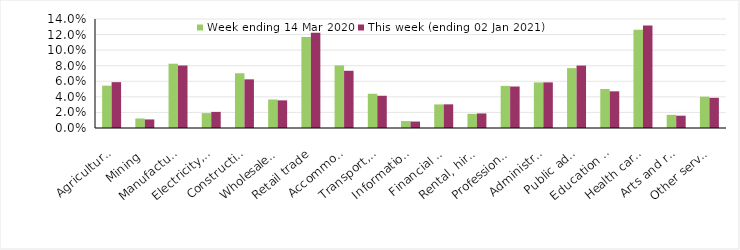
| Category | Week ending 14 Mar 2020 | This week (ending 02 Jan 2021) |
|---|---|---|
| Agriculture, forestry and fishing | 0.054 | 0.059 |
| Mining | 0.012 | 0.011 |
| Manufacturing | 0.083 | 0.08 |
| Electricity, gas, water and waste services | 0.019 | 0.021 |
| Construction | 0.07 | 0.062 |
| Wholesale trade | 0.037 | 0.036 |
| Retail trade | 0.117 | 0.122 |
| Accommodation and food services | 0.08 | 0.074 |
| Transport, postal and warehousing | 0.044 | 0.041 |
| Information media and telecommunications | 0.009 | 0.008 |
| Financial and insurance services | 0.03 | 0.03 |
| Rental, hiring and real estate services | 0.018 | 0.019 |
| Professional, scientific and technical services | 0.054 | 0.053 |
| Administrative and support services | 0.058 | 0.059 |
| Public administration and safety | 0.077 | 0.08 |
| Education and training | 0.05 | 0.047 |
| Health care and social assistance | 0.126 | 0.132 |
| Arts and recreation services | 0.017 | 0.016 |
| Other services | 0.04 | 0.039 |